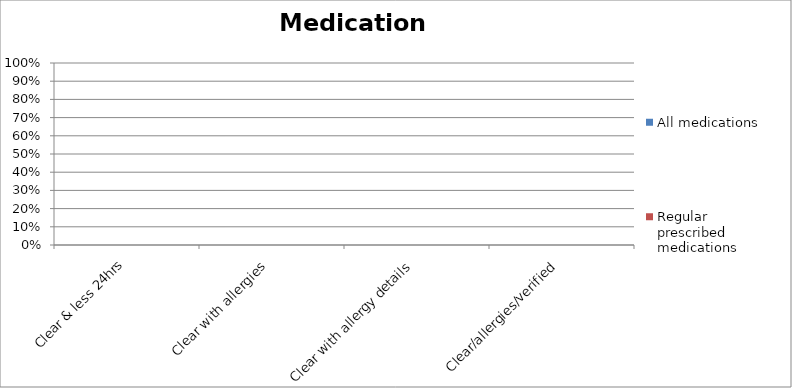
| Category | All medications | Regular prescribed medications |
|---|---|---|
| Clear & less 24hrs | 0 | 0 |
| Clear with allergies | 0 | 0 |
| Clear with allergy details | 0 | 0 |
| Clear/allergies/verified | 0 | 0 |